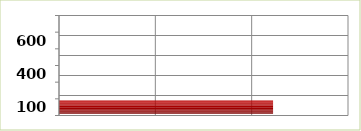
| Category | Series 0 |
|---|---|
| 100.0 | 4444230 |
| 200.0 | 0 |
| 400.0 | 1 |
| 500.0 | 0 |
| 600.0 | 0 |
| 700.0 | 0 |